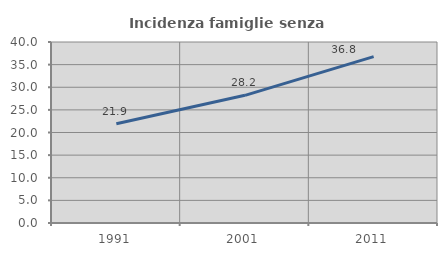
| Category | Incidenza famiglie senza nuclei |
|---|---|
| 1991.0 | 21.944 |
| 2001.0 | 28.213 |
| 2011.0 | 36.774 |